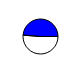
| Category | Series 0 |
|---|---|
| 0 | 34323 |
| 1 | 32660 |